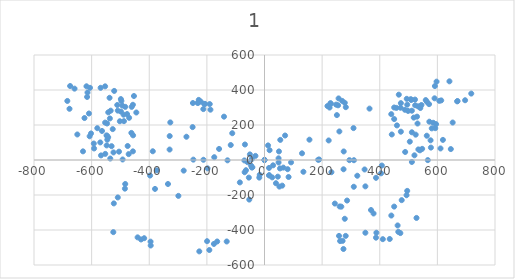
| Category | Series 0 |
|---|---|
| -280.44900000000007 | -60.735 |
| 387.03099999999995 | -101.819 |
| 350.11400000000003 | -150.645 |
| 232.21900000000005 | -69.666 |
| 0.0 | 0 |
| -157.64099999999996 | 63.264 |
| -246.95600000000002 | 2.084 |
| 48.825000000000045 | 9.527 |
| -380.03600000000006 | -165.233 |
| -522.94 | -247.998 |
| -394.922 | -488.553 |
| 186.221 | 1.19 |
| 274.94100000000003 | 48.825 |
| 274.346 | -52.994 |
| 244.12699999999995 | -248.892 |
| 260.799 | -265.564 |
| 434.66599999999994 | -451.339 |
| 350.11400000000003 | -415.613 |
| 462.05600000000004 | -373.933 |
| 527.5540000000001 | -331.061 |
| 493.01800000000003 | -201.257 |
| 48.825000000000045 | -14.291 |
| -44.06200000000001 | -42.872 |
| -64.30700000000002 | -58.353 |
| -226.265 | -522.195 |
| -111.94200000000001 | 153.026 |
| -140.52300000000002 | 247.7 |
| 511.4770000000001 | -11.314 |
| 488.2549999999999 | 45.848 |
| 547.203 | 63.711 |
| 504.3319999999999 | 104.796 |
| 441.8109999999999 | 145.881 |
| 459.674 | 197.683 |
| 511.4770000000001 | 158.385 |
| 531.126 | 208.401 |
| 595.433 | 204.829 |
| 529.3399999999999 | 247.7 |
| 440.0250000000001 | 261.99 |
| 457.8879999999999 | 297.716 |
| 218.5239999999999 | 308.434 |
| 511.4770000000001 | 281.64 |
| 532.912 | 306.648 |
| 559.7069999999999 | 342.374 |
| 613.296 | 340.587 |
| 668.671 | 335.229 |
| 641.877 | 449.552 |
| 597.219 | 447.765 |
| -229.83799999999997 | 328.083 |
| -206.61599999999999 | 320.938 |
| -456.698 | 315.579 |
| -453.125 | 365.596 |
| -553.158 | 420.971 |
| -615.678 | 360.237 |
| -674.626 | 422.757 |
| -553.158 | 213.76 |
| -462.057 | 154.812 |
| -492.424 | 2.977 |
| -456.698 | 49.421 |
| -535.2950000000001 | 8.336 |
| -504.928 | 47.634 |
| -567.4480000000001 | 26.199 |
| -547.799 | 83.36 |
| -592.457 | 94.078 |
| -629.969 | 49.421 |
| -649.6179999999999 | 145.881 |
| -546.013 | 136.949 |
| 0.0 | 0 |
| 407.2019999999999 | -31.632 |
| 322.05499999999995 | -89.985 |
| 29.697000000000003 | -30.441 |
| 80.30899999999997 | -52.472 |
| -329.34900000000005 | 59.767 |
| -174.38700000000006 | 16.002 |
| -211.89999999999998 | 1.265 |
| -440.39700000000005 | -442.035 |
| -417.622 | -446.947 |
| 259.832 | 163.074 |
| 222.76699999999994 | 111.718 |
| 450.073 | -266.233 |
| 369.68999999999994 | -285.882 |
| 278.5880000000001 | -335.899 |
| 26.719999999999914 | -99.214 |
| -68.84699999999998 | -69.74 |
| -387.702 | 49.942 |
| -502.02500000000003 | 221.427 |
| -469.87100000000004 | 241.076 |
| -444.86300000000006 | 271.443 |
| -477.01700000000005 | 262.512 |
| -460.94000000000005 | 303.597 |
| -509.17 | 282.161 |
| -496.66600000000005 | 337.536 |
| -537.751 | 355.399 |
| -521.674 | 394.698 |
| -187.63600000000008 | 287.52 |
| -209.07100000000003 | 319.673 |
| 230.35800000000006 | 321.46 |
| 255.36700000000008 | 312.528 |
| 278.5880000000001 | 326.819 |
| 257.1529999999999 | 351.827 |
| 450.073 | 233.931 |
| 498.303 | 280.375 |
| 544.747 | 314.315 |
| 450.073 | 300.024 |
| 509.0210000000001 | 342.895 |
| 466.15 | 373.262 |
| 364.46799999999996 | 293.635 |
| 0.0 | 0 |
| 15.69299999999987 | -45.315 |
| -16.461000000000013 | -84.614 |
| -335.01700000000005 | -137.161 |
| -329.0630000000001 | 136.739 |
| -128.40200000000004 | -1.848 |
| -50.69800000000009 | 32.091 |
| 50.22799999999995 | 49.061 |
| 53.801000000000045 | -48.292 |
| 294.6529999999999 | -0.806 |
| 308.94399999999985 | 182.289 |
| 471.49699999999996 | -417.61 |
| 464.352 | -410.465 |
| 386.946 | -443.809 |
| -428.5 | -454.08 |
| -395.45400000000006 | -466.584 |
| -42.06400000000008 | -41.742 |
| -85.53100000000006 | -128.08 |
| 61.541000000000054 | -146.539 |
| 83.572 | -97.118 |
| 495.31399999999996 | -176.459 |
| 258.63 | -433.686 |
| 281.852 | -433.686 |
| -509.1820000000001 | -213.972 |
| -484.471 | -163.806 |
| -471.37200000000007 | 33.58 |
| -474.9440000000001 | 80.024 |
| -580.336 | 181.843 |
| -546.3960000000001 | 208.637 |
| -498.16600000000005 | 276.517 |
| -533.892 | 281.876 |
| -614.2760000000001 | 385.481 |
| -676.796 | 292.593 |
| -526.7470000000001 | 176.484 |
| -548.183 | 140.758 |
| -617.8480000000001 | 421.207 |
| -221.29000000000008 | 333.678 |
| -212.35800000000006 | 290.807 |
| 228.85800000000006 | 324.747 |
| 534.0179999999999 | 60.523 |
| 473.283 | 161.747 |
| 580.4609999999999 | 180.801 |
| 653.1039999999999 | 214.145 |
| 572.1249999999999 | 218.909 |
| 472.09299999999996 | 298.697 |
| 473.283 | 324.896 |
| 507.81899999999985 | 347.522 |
| 563.7889999999999 | 332.041 |
| 606.66 | 337.995 |
| -609.2620000000001 | 265.679 |
| 269.67399999999986 | 337.592 |
| 0.0 | 0 |
| 16.225000000000023 | -87.566 |
| 16.076000000000022 | -87.119 |
| -456.10200000000003 | 140.932 |
| -326.89300000000003 | 214.765 |
| -249.48699999999997 | 187.971 |
| -373.486 | -59.134 |
| -52.84500000000003 | -226.153 |
| 12.355000000000018 | 83.324 |
| 17.713999999999942 | 56.082 |
| -117.15200000000004 | 85.556 |
| 130.25099999999998 | 38.219 |
| -43.91300000000001 | 5.173 |
| -59.09699999999998 | -12.244 |
| 347.43499999999995 | -54.073 |
| 404.597 | -76.104 |
| 309.923 | -152.915 |
| 271.0709999999999 | -462.093 |
| 286.5519999999999 | -231.661 |
| -191.43200000000002 | -514.343 |
| -164.19100000000003 | -465.666 |
| -131.144 | -465.666 |
| -483.343 | -137.136 |
| -270.922 | 132.893 |
| 65.34899999999993 | -43.504 |
| 135.014 | -67.321 |
| 51.653999999999996 | -151.873 |
| 310.3689999999999 | -1.228 |
| 440.174 | -317.403 |
| 388.3710000000001 | -415.65 |
| 274.048 | -508.537 |
| -199.322 | -463.88 |
| -530.6800000000001 | 79.007 |
| -524.13 | 43.281 |
| -552.711 | 34.945 |
| -591.414 | 65.907 |
| -606.896 | 135.573 |
| -545.566 | 115.924 |
| -483.343 | 303.634 |
| -511.031 | 314.352 |
| -542.2909999999999 | 272.374 |
| -67.88 | 88.682 |
| 54.77999999999997 | 114.882 |
| 71.452 | 139.89 |
| 156.00299999999993 | 116.072 |
| 251.2729999999999 | 256.595 |
| 282.2349999999999 | 301.848 |
| 495.4000000000001 | 316.138 |
| 518.027 | 242.304 |
| 563.28 | 138.699 |
| 576.3789999999999 | 112.5 |
| 577.5699999999999 | 70.819 |
| 619.25 | 114.882 |
| 646.6399999999999 | 62.483 |
| 610.914 | 66.056 |
| 539.462 | 55.338 |
| 520.4079999999999 | 26.757 |
| 566.8520000000001 | -0.633 |
| -298.908 | -205.015 |
| -197.68400000000008 | -47.634 |
| 0.0 | 0 |
| -69.81500000000005 | -2.381 |
| -31.410000000000082 | 23.52 |
| 92.1429999999998 | -13.546 |
| 266.605 | -266.605 |
| 189.64499999999998 | 2.977 |
| 262.4369999999999 | -463.098 |
| 410.6999999999998 | -452.38 |
| -524.7260000000001 | -412.189 |
| -175.50400000000013 | -479.621 |
| -397.0060000000001 | -88.868 |
| -46.593000000000075 | -32.153 |
| -18.01200000000017 | -100.628 |
| 39.74499999999989 | -132.781 |
| 46.29399999999987 | -95.269 |
| -54.33400000000006 | -100.628 |
| -569.979 | 100.48 |
| -542.589 | 130.251 |
| -602.1320000000001 | 151.687 |
| -564.0250000000001 | 165.977 |
| -536.6350000000001 | 237.429 |
| -487.8090000000001 | 221.948 |
| -489.0000000000001 | 258.865 |
| -493.7640000000001 | 311.263 |
| -624.759 | 239.811 |
| -684.3020000000001 | 337.462 |
| -659.2940000000001 | 407.723 |
| -605.7050000000002 | 412.487 |
| -568.7880000000001 | 412.487 |
| -498.52700000000004 | 348.18 |
| -248.44500000000005 | 325.553 |
| -231.77300000000014 | 325.553 |
| -190.09300000000007 | 319.599 |
| -228.20000000000005 | 343.416 |
| 590.223 | 352.497 |
| 571.1689999999999 | 319.153 |
| 540.8019999999999 | 297.121 |
| 487.21299999999997 | 286.999 |
| 522.9389999999999 | 312.603 |
| 522.3429999999998 | 345.352 |
| 493.7629999999999 | 349.52 |
| 585.4589999999998 | 212.719 |
| 592.605 | 181.756 |
| 524.7249999999999 | 144.839 |
| 225.81799999999998 | 299.652 |
| 248.44399999999996 | 316.324 |
| 591.414 | 422.46 |
| 717.646 | 379.589 |
| 696.2099999999998 | 341.481 |
| 670.011 | 336.718 |
| 378.5459999999998 | -305.606 |
| 476.1969999999999 | -229.39 |